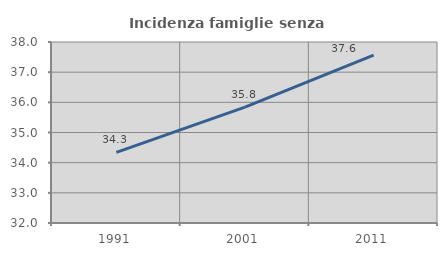
| Category | Incidenza famiglie senza nuclei |
|---|---|
| 1991.0 | 34.342 |
| 2001.0 | 35.841 |
| 2011.0 | 37.564 |